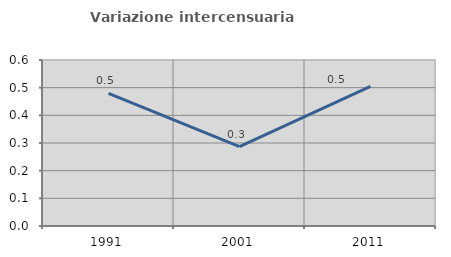
| Category | Variazione intercensuaria annua |
|---|---|
| 1991.0 | 0.479 |
| 2001.0 | 0.287 |
| 2011.0 | 0.504 |